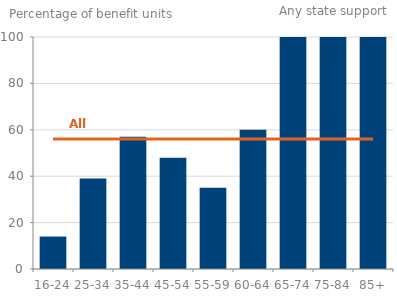
| Category | Series 0 |
|---|---|
| 0 | 14 |
| 1 | 39 |
| 2 | 57 |
| 3 | 48 |
| 4 | 35 |
| 5 | 60 |
| 6 | 100 |
| 7 | 100 |
| 8 | 100 |